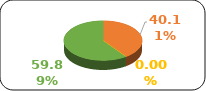
| Category | Series 0 |
|---|---|
| 0 | 0.401 |
| 1 | 0 |
| 2 | 0.599 |